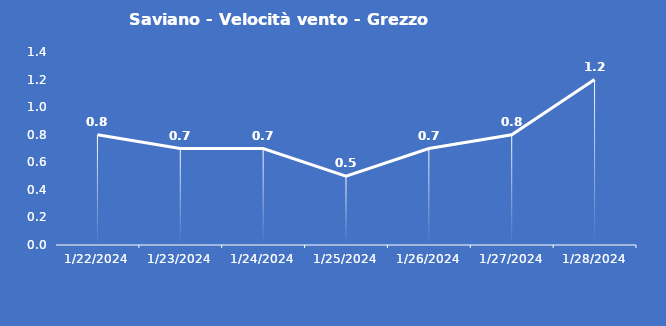
| Category | Saviano - Velocità vento - Grezzo (m/s) |
|---|---|
| 1/22/24 | 0.8 |
| 1/23/24 | 0.7 |
| 1/24/24 | 0.7 |
| 1/25/24 | 0.5 |
| 1/26/24 | 0.7 |
| 1/27/24 | 0.8 |
| 1/28/24 | 1.2 |